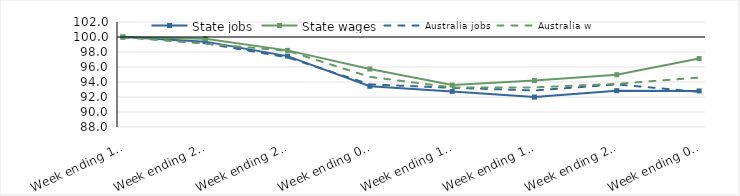
| Category | State jobs | State wages | Australia jobs | Australia wages |
|---|---|---|---|---|
| 2020-03-14 | 100 | 100 | 100 | 100 |
| 2020-03-21 | 99.381 | 99.778 | 99.165 | 99.123 |
| 2020-03-28 | 97.451 | 98.216 | 97.282 | 98.156 |
| 2020-04-04 | 93.428 | 95.729 | 93.679 | 94.686 |
| 2020-04-11 | 92.746 | 93.592 | 93.222 | 93.277 |
| 2020-04-18 | 91.992 | 94.19 | 92.871 | 93.281 |
| 2020-04-25 | 92.846 | 94.972 | 93.679 | 93.754 |
| 2020-05-02 | 92.807 | 97.123 | 92.686 | 94.591 |